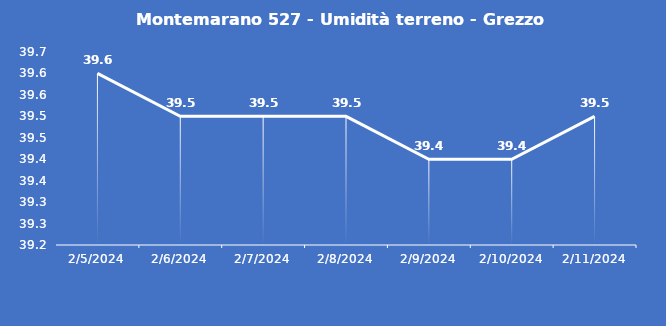
| Category | Montemarano 527 - Umidità terreno - Grezzo (%VWC) |
|---|---|
| 2/5/24 | 39.6 |
| 2/6/24 | 39.5 |
| 2/7/24 | 39.5 |
| 2/8/24 | 39.5 |
| 2/9/24 | 39.4 |
| 2/10/24 | 39.4 |
| 2/11/24 | 39.5 |